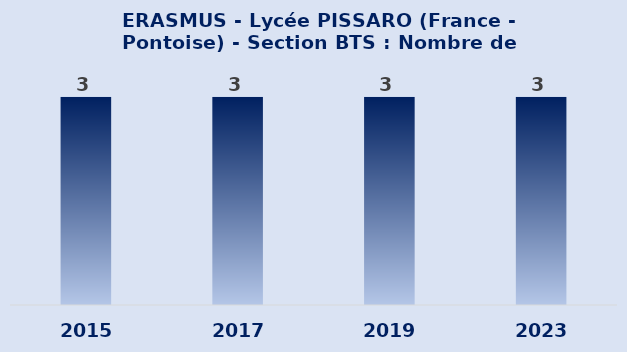
| Category | ERASMUS - Lycée PISSARO (France - Pontoise) - Section BTS : Nombre de europass générés |
|---|---|
| 2015 | 3 |
| 2017 | 3 |
| 2019 | 3 |
| 2023 | 3 |